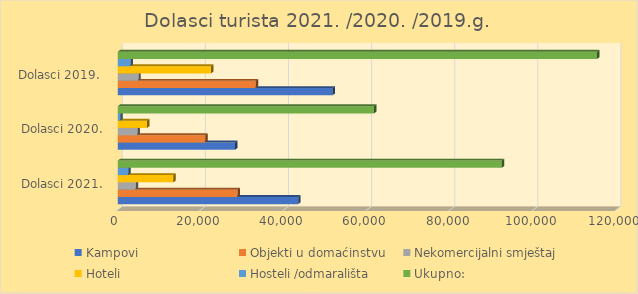
| Category | Kampovi | Objekti u domaćinstvu | Nekomercijalni smještaj | Hoteli | Hosteli /odmarališta | Ukupno: |
|---|---|---|---|---|---|---|
| Dolasci 2021. | 43408 | 28805 | 4322 | 13370 | 2514 | 92419 |
| Dolasci 2020. | 28242 | 21051 | 4756 | 7039 | 574 | 61662 |
| Dolasci 2019.  | 51685 | 33212 | 4962 | 22423 | 3044 | 115326 |